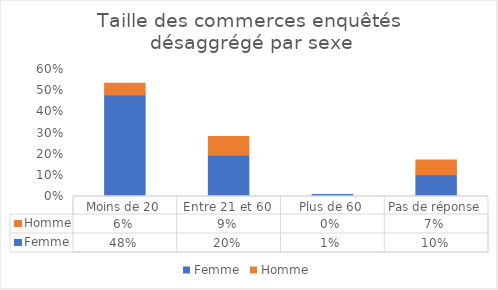
| Category | Femme | Homme |
|---|---|---|
| Moins de 20 | 0.479 | 0.056 |
| Entre 21 et 60 | 0.195 | 0.088 |
| Plus de 60 | 0.009 | 0 |
| Pas de réponse | 0.102 | 0.07 |